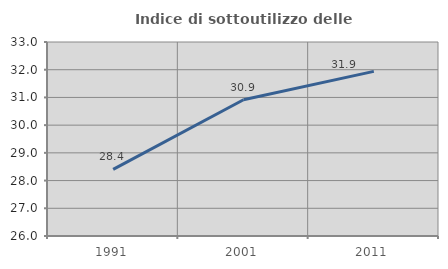
| Category | Indice di sottoutilizzo delle abitazioni  |
|---|---|
| 1991.0 | 28.402 |
| 2001.0 | 30.916 |
| 2011.0 | 31.939 |